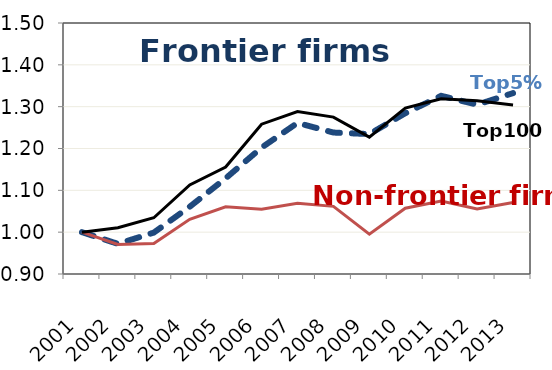
| Category | Average | Non-frontier (ORBIS) | Series 0 |
|---|---|---|---|
| 2001.0 | 1 | 1 | 1 |
| 2002.0 | 0.972 | 0.97 | 1.011 |
| 2003.0 | 0.999 | 0.973 | 1.034 |
| 2004.0 | 1.061 | 1.031 | 1.113 |
| 2005.0 | 1.129 | 1.061 | 1.156 |
| 2006.0 | 1.202 | 1.055 | 1.258 |
| 2007.0 | 1.261 | 1.069 | 1.288 |
| 2008.0 | 1.238 | 1.062 | 1.275 |
| 2009.0 | 1.234 | 0.995 | 1.227 |
| 2010.0 | 1.284 | 1.057 | 1.297 |
| 2011.0 | 1.326 | 1.075 | 1.319 |
| 2012.0 | 1.305 | 1.056 | 1.314 |
| 2013.0 | 1.332 | 1.071 | 1.304 |